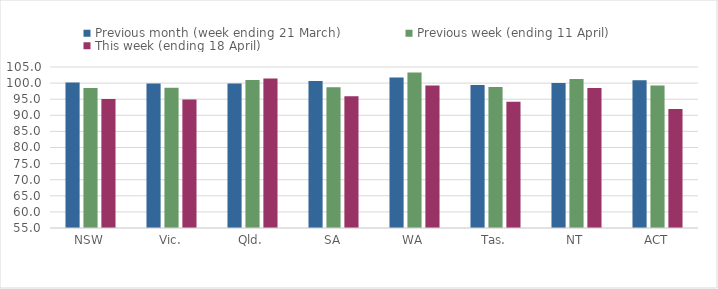
| Category | Previous month (week ending 21 March) | Previous week (ending 11 April) | This week (ending 18 April) |
|---|---|---|---|
| NSW | 100.203 | 98.47 | 95.04 |
| Vic. | 99.862 | 98.545 | 94.911 |
| Qld. | 99.873 | 100.955 | 101.46 |
| SA | 100.654 | 98.687 | 95.916 |
| WA | 101.768 | 103.309 | 99.257 |
| Tas. | 99.426 | 98.806 | 94.195 |
| NT | 100 | 101.309 | 98.478 |
| ACT | 100.903 | 99.244 | 91.969 |